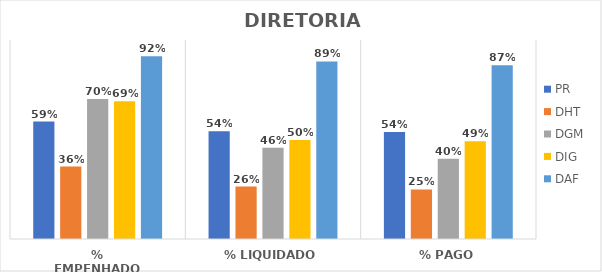
| Category | PR | DHT | DGM | DIG | DAF |
|---|---|---|---|---|---|
| % EMPENHADO | 0.59 | 0.364 | 0.704 | 0.692 | 0.919 |
| % LIQUIDADO | 0.542 | 0.263 | 0.459 | 0.498 | 0.892 |
| % PAGO | 0.538 | 0.249 | 0.403 | 0.491 | 0.874 |